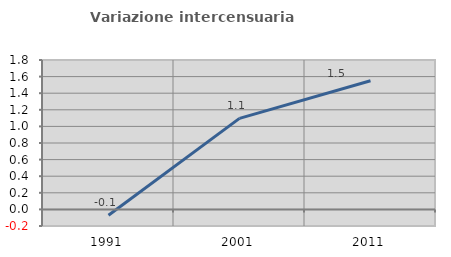
| Category | Variazione intercensuaria annua |
|---|---|
| 1991.0 | -0.07 |
| 2001.0 | 1.097 |
| 2011.0 | 1.55 |